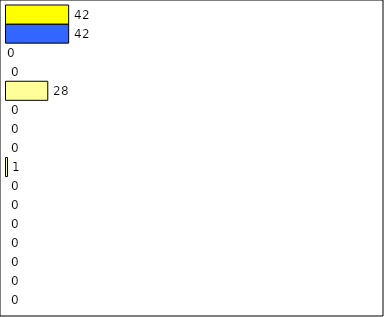
| Category | -2 | -1 | 0 | 1 | 2 | 3 | 4 | 5 | 6 | 7 | 8 | 9 | 10 | 11 | 12 | Perfect Round |
|---|---|---|---|---|---|---|---|---|---|---|---|---|---|---|---|---|
| 0 | 0 | 0 | 0 | 0 | 0 | 0 | 0 | 1 | 0 | 0 | 0 | 28 | 0 | 0 | 42 | 42 |